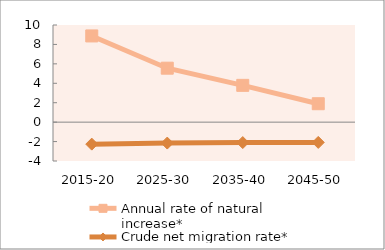
| Category | Annual rate of natural increase* | Crude net migration rate* |
|---|---|---|
| 2015-20 | 8.875 | -2.263 |
| 2025-30 | 5.555 | -2.155 |
| 2035-40 | 3.788 | -2.102 |
| 2045-50 | 1.895 | -2.086 |